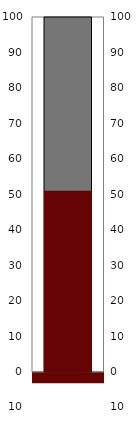
| Category | Series 1 | Series 4 |
|---|---|---|
| 0 | -3 | 110 |